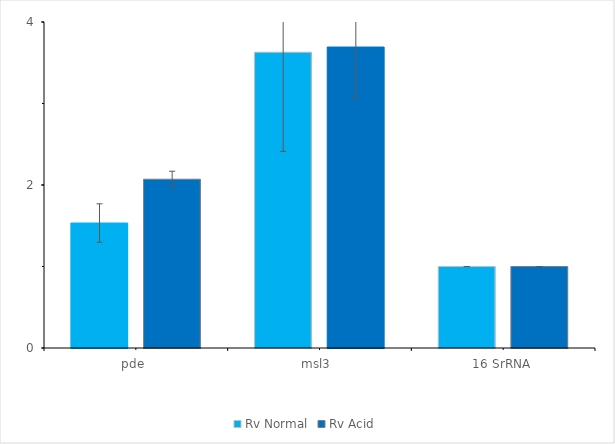
| Category | Rv Normal | Rv Acid |
|---|---|---|
| pde  | 1.533 | 2.071 |
| msl3  | 3.629 | 3.693 |
| 16 SrRNA | 1 | 1 |